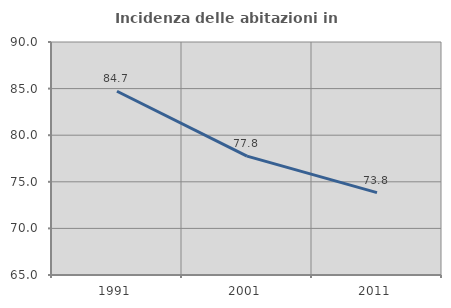
| Category | Incidenza delle abitazioni in proprietà  |
|---|---|
| 1991.0 | 84.714 |
| 2001.0 | 77.751 |
| 2011.0 | 73.84 |